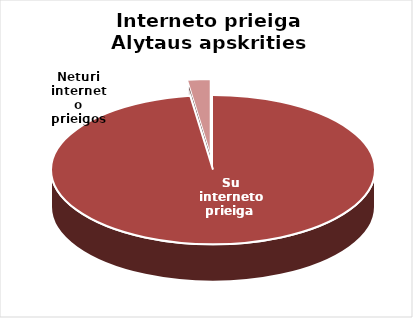
| Category | Series 0 |
|---|---|
| Su interneto prieiga  | 87 |
| Neturi interneto prieigos | 2 |